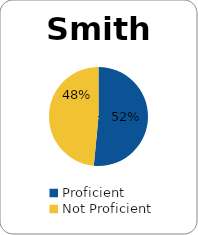
| Category | Series 0 |
|---|---|
| Proficient | 0.515 |
| Not Proficient | 0.485 |